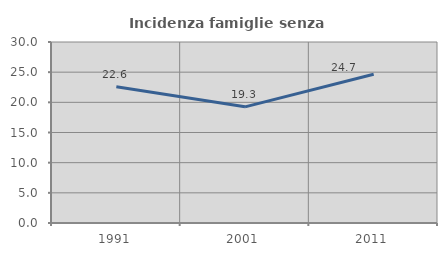
| Category | Incidenza famiglie senza nuclei |
|---|---|
| 1991.0 | 22.581 |
| 2001.0 | 19.252 |
| 2011.0 | 24.654 |